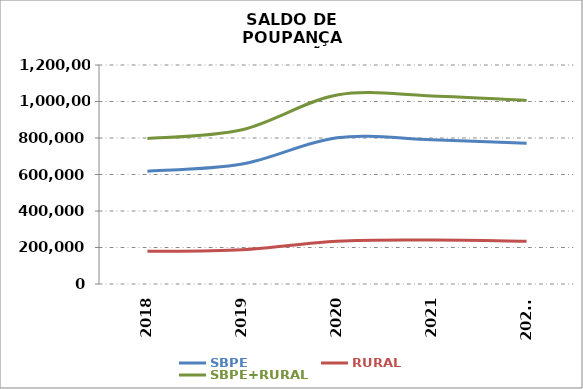
| Category | SBPE | RURAL | SBPE+RURAL |
|---|---|---|---|
| 2018 | 618146.063 | 179134.939 | 797281.002 |
| 2019 | 657531.442 | 187933.103 | 845464.545 |
| 2020 | 801437.985 | 234189.821 | 1035627.806 |
| 2021 | 790109.013 | 240493.997 | 1030603.01 |
| 2022* | 771576.872 | 234591.247 | 1006168.119 |